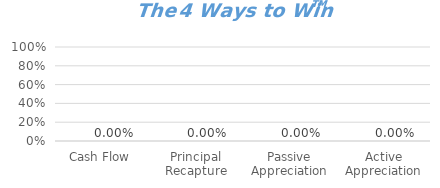
| Category | Series 0 | Series 1 |
|---|---|---|
| Cash Flow |  | 0 |
| Principal Recapture |  | 0 |
| Passive Appreciation |  | 0 |
| Active Appreciation |  | 0 |